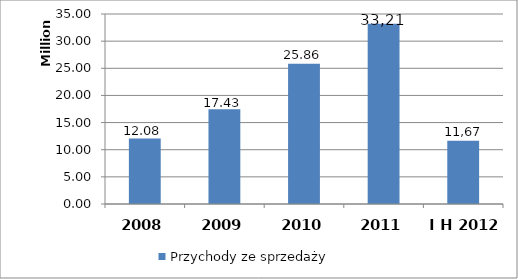
| Category | Przychody ze sprzedaży |
|---|---|
| 2008 | 12075400 |
| 2009 | 17433700 |
| 2010 | 25855700 |
| 2011 | 33207058.23 |
| I H 2012 | 11670057.39 |